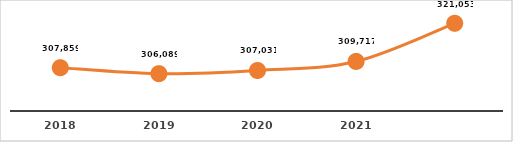
| Category | MATRÍCULA TOTAL |
|---|---|
| 2018.0 | 307859 |
| 2019.0 | 306089 |
| 2020.0 | 307031 |
| 2021.0 | 309717 |